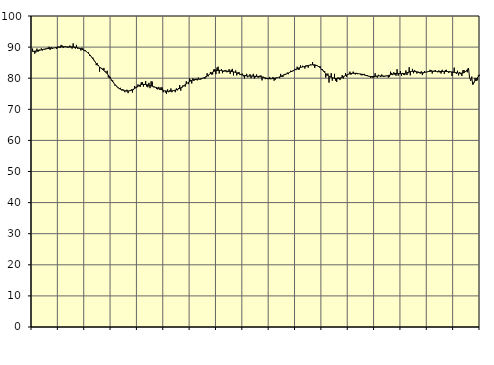
| Category | Piggar | Series 1 |
|---|---|---|
| nan | 89.5 | 88.61 |
| 87.0 | 88.5 | 88.64 |
| 87.0 | 87.9 | 88.69 |
| 87.0 | 88.3 | 88.74 |
| 87.0 | 89.5 | 88.8 |
| 87.0 | 88.5 | 88.87 |
| 87.0 | 89.2 | 88.95 |
| 87.0 | 89 | 89.03 |
| 87.0 | 89.6 | 89.12 |
| 87.0 | 88.9 | 89.22 |
| 87.0 | 89.4 | 89.3 |
| 87.0 | 89.2 | 89.38 |
| nan | 89.3 | 89.44 |
| 88.0 | 89.4 | 89.49 |
| 88.0 | 89.8 | 89.54 |
| 88.0 | 90.1 | 89.58 |
| 88.0 | 89.1 | 89.62 |
| 88.0 | 90 | 89.65 |
| 88.0 | 89.4 | 89.68 |
| 88.0 | 89.7 | 89.71 |
| 88.0 | 89.7 | 89.76 |
| 88.0 | 89.9 | 89.81 |
| 88.0 | 89.4 | 89.87 |
| 88.0 | 90.2 | 89.94 |
| nan | 90.1 | 90.01 |
| 89.0 | 89.7 | 90.06 |
| 89.0 | 90.7 | 90.1 |
| 89.0 | 90.5 | 90.12 |
| 89.0 | 89.7 | 90.12 |
| 89.0 | 90 | 90.11 |
| 89.0 | 90.3 | 90.09 |
| 89.0 | 90 | 90.08 |
| 89.0 | 89.8 | 90.07 |
| 89.0 | 89.9 | 90.07 |
| 89.0 | 90.5 | 90.08 |
| 89.0 | 89.9 | 90.08 |
| nan | 89.5 | 90.08 |
| 90.0 | 91.2 | 90.06 |
| 90.0 | 89.8 | 90.02 |
| 90.0 | 89.5 | 89.97 |
| 90.0 | 90.7 | 89.89 |
| 90.0 | 89.5 | 89.81 |
| 90.0 | 89.6 | 89.71 |
| 90.0 | 89.4 | 89.6 |
| 90.0 | 88.9 | 89.48 |
| 90.0 | 89.8 | 89.34 |
| 90.0 | 89.5 | 89.19 |
| 90.0 | 88.7 | 89.01 |
| nan | 89 | 88.81 |
| 91.0 | 88.5 | 88.56 |
| 91.0 | 88.3 | 88.27 |
| 91.0 | 88.3 | 87.94 |
| 91.0 | 87.2 | 87.57 |
| 91.0 | 87.2 | 87.16 |
| 91.0 | 86.6 | 86.7 |
| 91.0 | 86.6 | 86.22 |
| 91.0 | 85.9 | 85.73 |
| 91.0 | 85.3 | 85.23 |
| 91.0 | 84.2 | 84.76 |
| 91.0 | 84.8 | 84.32 |
| nan | 84.2 | 83.93 |
| 92.0 | 82.1 | 83.59 |
| 92.0 | 83.4 | 83.29 |
| 92.0 | 83.3 | 83.01 |
| 92.0 | 83 | 82.75 |
| 92.0 | 83.3 | 82.48 |
| 92.0 | 82 | 82.18 |
| 92.0 | 82.1 | 81.84 |
| 92.0 | 82.4 | 81.44 |
| 92.0 | 80.3 | 80.99 |
| 92.0 | 80 | 80.5 |
| 92.0 | 80.4 | 79.97 |
| nan | 79.2 | 79.44 |
| 93.0 | 79.3 | 78.92 |
| 93.0 | 78.5 | 78.43 |
| 93.0 | 77.6 | 77.99 |
| 93.0 | 77.5 | 77.59 |
| 93.0 | 77.1 | 77.25 |
| 93.0 | 76.8 | 76.95 |
| 93.0 | 76.5 | 76.7 |
| 93.0 | 76.9 | 76.48 |
| 93.0 | 76.1 | 76.31 |
| 93.0 | 76.4 | 76.17 |
| 93.0 | 76.3 | 76.06 |
| nan | 75.5 | 75.97 |
| 94.0 | 76 | 75.9 |
| 94.0 | 76.3 | 75.86 |
| 94.0 | 75.2 | 75.86 |
| 94.0 | 76 | 75.91 |
| 94.0 | 76.2 | 75.99 |
| 94.0 | 76.4 | 76.12 |
| 94.0 | 75.4 | 76.29 |
| 94.0 | 76.2 | 76.5 |
| 94.0 | 77.5 | 76.73 |
| 94.0 | 76.8 | 76.97 |
| 94.0 | 77 | 77.21 |
| nan | 78 | 77.45 |
| 95.0 | 77.4 | 77.66 |
| 95.0 | 77.2 | 77.82 |
| 95.0 | 78.7 | 77.93 |
| 95.0 | 78.7 | 78 |
| 95.0 | 77.3 | 78.02 |
| 95.0 | 77.8 | 78.01 |
| 95.0 | 79.1 | 77.98 |
| 95.0 | 77.3 | 77.92 |
| 95.0 | 77.1 | 77.85 |
| 95.0 | 78.5 | 77.76 |
| 95.0 | 76.8 | 77.66 |
| nan | 79 | 77.54 |
| 96.0 | 78.9 | 77.43 |
| 96.0 | 77.1 | 77.32 |
| 96.0 | 77.1 | 77.21 |
| 96.0 | 77 | 77.1 |
| 96.0 | 76.5 | 76.98 |
| 96.0 | 76.4 | 76.85 |
| 96.0 | 77.2 | 76.7 |
| 96.0 | 76.2 | 76.54 |
| 96.0 | 77.1 | 76.39 |
| 96.0 | 77 | 76.24 |
| 96.0 | 75.5 | 76.11 |
| nan | 76 | 76 |
| 97.0 | 75.4 | 75.91 |
| 97.0 | 75 | 75.84 |
| 97.0 | 76.4 | 75.79 |
| 97.0 | 75.5 | 75.77 |
| 97.0 | 76.1 | 75.79 |
| 97.0 | 76.7 | 75.84 |
| 97.0 | 75.5 | 75.91 |
| 97.0 | 76 | 75.99 |
| 97.0 | 75.9 | 76.08 |
| 97.0 | 75.5 | 76.17 |
| 97.0 | 76.7 | 76.27 |
| nan | 76.1 | 76.4 |
| 98.0 | 76.8 | 76.54 |
| 98.0 | 77.8 | 76.72 |
| 98.0 | 76 | 76.92 |
| 98.0 | 76.9 | 77.14 |
| 98.0 | 77.7 | 77.38 |
| 98.0 | 77.6 | 77.64 |
| 98.0 | 77.3 | 77.9 |
| 98.0 | 79 | 78.16 |
| 98.0 | 78.4 | 78.43 |
| 98.0 | 78.1 | 78.68 |
| 98.0 | 79.9 | 78.91 |
| nan | 79.5 | 79.12 |
| 99.0 | 78.3 | 79.28 |
| 99.0 | 80 | 79.41 |
| 99.0 | 79.1 | 79.51 |
| 99.0 | 79.8 | 79.58 |
| 99.0 | 79.8 | 79.63 |
| 99.0 | 79.3 | 79.66 |
| 99.0 | 80.2 | 79.69 |
| 99.0 | 79.6 | 79.73 |
| 99.0 | 79.6 | 79.79 |
| 99.0 | 79.7 | 79.87 |
| 99.0 | 80.1 | 79.98 |
| nan | 80.1 | 80.13 |
| 0.0 | 79.8 | 80.3 |
| 0.0 | 80.3 | 80.5 |
| 0.0 | 81.6 | 80.72 |
| 0.0 | 80.6 | 80.96 |
| 0.0 | 81.3 | 81.22 |
| 0.0 | 82 | 81.47 |
| 0.0 | 81.2 | 81.72 |
| 0.0 | 81.2 | 81.95 |
| 0.0 | 82.8 | 82.15 |
| 0.0 | 82.9 | 82.31 |
| 0.0 | 81.3 | 82.43 |
| nan | 83.4 | 82.5 |
| 1.0 | 83.7 | 82.53 |
| 1.0 | 81.5 | 82.53 |
| 1.0 | 82.5 | 82.49 |
| 1.0 | 82.9 | 82.43 |
| 1.0 | 81.6 | 82.37 |
| 1.0 | 82.1 | 82.32 |
| 1.0 | 82.5 | 82.28 |
| 1.0 | 82.6 | 82.26 |
| 1.0 | 81.9 | 82.24 |
| 1.0 | 82 | 82.24 |
| 1.0 | 82.9 | 82.23 |
| nan | 81.4 | 82.2 |
| 2.0 | 82.7 | 82.16 |
| 2.0 | 83 | 82.1 |
| 2.0 | 80.9 | 82.03 |
| 2.0 | 82 | 81.95 |
| 2.0 | 82.5 | 81.84 |
| 2.0 | 80.9 | 81.72 |
| 2.0 | 81.8 | 81.58 |
| 2.0 | 82 | 81.44 |
| 2.0 | 81 | 81.29 |
| 2.0 | 81.2 | 81.16 |
| 2.0 | 81.5 | 81.03 |
| nan | 80.6 | 80.93 |
| 3.0 | 79.9 | 80.84 |
| 3.0 | 81 | 80.78 |
| 3.0 | 81.4 | 80.73 |
| 3.0 | 80.3 | 80.71 |
| 3.0 | 80.7 | 80.7 |
| 3.0 | 81.3 | 80.69 |
| 3.0 | 80 | 80.68 |
| 3.0 | 80.8 | 80.66 |
| 3.0 | 81.4 | 80.65 |
| 3.0 | 79.9 | 80.63 |
| 3.0 | 80.3 | 80.62 |
| nan | 81.2 | 80.6 |
| 4.0 | 80.3 | 80.58 |
| 4.0 | 80.2 | 80.56 |
| 4.0 | 80.8 | 80.51 |
| 4.0 | 80.9 | 80.44 |
| 4.0 | 79.3 | 80.36 |
| 4.0 | 80.5 | 80.27 |
| 4.0 | 80.3 | 80.18 |
| 4.0 | 79.7 | 80.09 |
| 4.0 | 79.8 | 80 |
| 4.0 | 79.7 | 79.92 |
| 4.0 | 79.7 | 79.87 |
| nan | 80.4 | 79.84 |
| 5.0 | 79.7 | 79.83 |
| 5.0 | 79.9 | 79.85 |
| 5.0 | 80.4 | 79.89 |
| 5.0 | 79.2 | 79.94 |
| 5.0 | 79.5 | 80.01 |
| 5.0 | 80.3 | 80.09 |
| 5.0 | 80.2 | 80.18 |
| 5.0 | 80.3 | 80.29 |
| 5.0 | 80 | 80.42 |
| 5.0 | 81.4 | 80.56 |
| 5.0 | 80.5 | 80.72 |
| nan | 80.4 | 80.87 |
| 6.0 | 81.2 | 81.03 |
| 6.0 | 81.4 | 81.19 |
| 6.0 | 81.3 | 81.35 |
| 6.0 | 81.8 | 81.51 |
| 6.0 | 81.3 | 81.68 |
| 6.0 | 81.8 | 81.86 |
| 6.0 | 82.4 | 82.03 |
| 6.0 | 82 | 82.2 |
| 6.0 | 82.2 | 82.37 |
| 6.0 | 82.5 | 82.55 |
| 6.0 | 83 | 82.72 |
| nan | 82.6 | 82.89 |
| 7.0 | 83.7 | 83.06 |
| 7.0 | 82.7 | 83.21 |
| 7.0 | 82.8 | 83.34 |
| 7.0 | 84.1 | 83.46 |
| 7.0 | 83.6 | 83.55 |
| 7.0 | 84 | 83.63 |
| 7.0 | 83.7 | 83.71 |
| 7.0 | 83.1 | 83.79 |
| 7.0 | 84.1 | 83.88 |
| 7.0 | 84.1 | 83.97 |
| 7.0 | 83.4 | 84.06 |
| nan | 84.2 | 84.15 |
| 8.0 | 84.4 | 84.23 |
| 8.0 | 84.2 | 84.28 |
| 8.0 | 85.2 | 84.32 |
| 8.0 | 84.1 | 84.33 |
| 8.0 | 83.3 | 84.29 |
| 8.0 | 83.9 | 84.2 |
| 8.0 | 84.1 | 84.06 |
| 8.0 | 83.9 | 83.87 |
| 8.0 | 83.8 | 83.62 |
| 8.0 | 83.8 | 83.32 |
| 8.0 | 82.7 | 82.98 |
| nan | 82.9 | 82.61 |
| 9.0 | 82.4 | 82.23 |
| 9.0 | 82.3 | 81.86 |
| 9.0 | 80.2 | 81.51 |
| 9.0 | 80.9 | 81.19 |
| 9.0 | 81.5 | 80.91 |
| 9.0 | 78.6 | 80.68 |
| 9.0 | 80.4 | 80.48 |
| 9.0 | 81.6 | 80.32 |
| 9.0 | 79.2 | 80.18 |
| 9.0 | 80.1 | 80.07 |
| 9.0 | 81.4 | 79.97 |
| nan | 79.2 | 79.9 |
| 10.0 | 78.8 | 79.87 |
| 10.0 | 80.2 | 79.86 |
| 10.0 | 80.2 | 79.91 |
| 10.0 | 79.4 | 80 |
| 10.0 | 80.2 | 80.12 |
| 10.0 | 81 | 80.28 |
| 10.0 | 79.9 | 80.47 |
| 10.0 | 80.6 | 80.67 |
| 10.0 | 81.6 | 80.86 |
| 10.0 | 80.5 | 81.04 |
| 10.0 | 81 | 81.2 |
| nan | 81.4 | 81.33 |
| 11.0 | 82.1 | 81.44 |
| 11.0 | 81.1 | 81.52 |
| 11.0 | 81.6 | 81.57 |
| 11.0 | 82.1 | 81.59 |
| 11.0 | 81.4 | 81.59 |
| 11.0 | 81.2 | 81.57 |
| 11.0 | 81.7 | 81.53 |
| 11.0 | 81.3 | 81.49 |
| 11.0 | 81.5 | 81.44 |
| 11.0 | 81.4 | 81.39 |
| 11.0 | 81 | 81.33 |
| nan | 80.9 | 81.27 |
| 12.0 | 81.3 | 81.19 |
| 12.0 | 81.4 | 81.09 |
| 12.0 | 80.8 | 80.98 |
| 12.0 | 80.7 | 80.87 |
| 12.0 | 81 | 80.76 |
| 12.0 | 80.6 | 80.67 |
| 12.0 | 80.7 | 80.6 |
| 12.0 | 80.1 | 80.55 |
| 12.0 | 80.7 | 80.53 |
| 12.0 | 80.1 | 80.54 |
| 12.0 | 80.3 | 80.57 |
| nan | 81.6 | 80.61 |
| 13.0 | 80.5 | 80.66 |
| 13.0 | 80.2 | 80.7 |
| 13.0 | 81.1 | 80.73 |
| 13.0 | 80.8 | 80.74 |
| 13.0 | 80.4 | 80.72 |
| 13.0 | 81.2 | 80.7 |
| 13.0 | 80.8 | 80.67 |
| 13.0 | 80.4 | 80.66 |
| 13.0 | 80.7 | 80.67 |
| 13.0 | 80.8 | 80.71 |
| 13.0 | 80.7 | 80.78 |
| nan | 80.2 | 80.87 |
| 14.0 | 80.4 | 80.98 |
| 14.0 | 82.1 | 81.1 |
| 14.0 | 81.7 | 81.23 |
| 14.0 | 81 | 81.34 |
| 14.0 | 81.9 | 81.44 |
| 14.0 | 81.1 | 81.5 |
| 14.0 | 80.8 | 81.54 |
| 14.0 | 82.9 | 81.54 |
| 14.0 | 80.8 | 81.52 |
| 14.0 | 81.4 | 81.48 |
| 14.0 | 82.3 | 81.45 |
| nan | 80.8 | 81.44 |
| 15.0 | 81.7 | 81.45 |
| 15.0 | 81.1 | 81.48 |
| 15.0 | 81 | 81.54 |
| 15.0 | 82.5 | 81.63 |
| 15.0 | 81 | 81.74 |
| 15.0 | 81.6 | 81.87 |
| 15.0 | 83.5 | 81.99 |
| 15.0 | 80.9 | 82.1 |
| 15.0 | 82.3 | 82.18 |
| 15.0 | 83 | 82.23 |
| 15.0 | 81.6 | 82.23 |
| nan | 82.6 | 82.18 |
| 16.0 | 82.3 | 82.11 |
| 16.0 | 81.5 | 82.03 |
| 16.0 | 82.1 | 81.93 |
| 16.0 | 82 | 81.85 |
| 16.0 | 81.5 | 81.78 |
| 16.0 | 82.2 | 81.76 |
| 16.0 | 81 | 81.76 |
| 16.0 | 81.6 | 81.8 |
| 16.0 | 82.3 | 81.86 |
| 16.0 | 81.9 | 81.94 |
| 16.0 | 81.9 | 82.03 |
| nan | 82.1 | 82.11 |
| 17.0 | 82.2 | 82.17 |
| 17.0 | 82.7 | 82.23 |
| 17.0 | 82.6 | 82.25 |
| 17.0 | 81.5 | 82.26 |
| 17.0 | 82.1 | 82.25 |
| 17.0 | 82.4 | 82.23 |
| 17.0 | 82.6 | 82.19 |
| 17.0 | 82.1 | 82.16 |
| 17.0 | 81.9 | 82.13 |
| 17.0 | 82.5 | 82.12 |
| 17.0 | 81.9 | 82.13 |
| nan | 81.5 | 82.15 |
| 18.0 | 82.7 | 82.16 |
| 18.0 | 82.2 | 82.17 |
| 18.0 | 81.4 | 82.17 |
| 18.0 | 82.6 | 82.16 |
| 18.0 | 82.7 | 82.15 |
| 18.0 | 82.3 | 82.13 |
| 18.0 | 81.7 | 82.1 |
| 18.0 | 82.2 | 82.07 |
| 18.0 | 82 | 82.04 |
| 18.0 | 80.7 | 81.99 |
| 18.0 | 82 | 81.93 |
| nan | 83.4 | 81.87 |
| 19.0 | 81.7 | 81.81 |
| 19.0 | 81.4 | 81.76 |
| 19.0 | 82.4 | 81.71 |
| 19.0 | 80.9 | 81.67 |
| 19.0 | 81.9 | 81.64 |
| 19.0 | 81.3 | 81.61 |
| 19.0 | 80.7 | 81.62 |
| 19.0 | 82.6 | 81.68 |
| 19.0 | 82.6 | 81.81 |
| 19.0 | 82 | 82.04 |
| 19.0 | 82.2 | 82.36 |
| nan | 81.9 | 82.76 |
| 20.0 | 82.6 | 83.25 |
| 20.0 | 80.3 | 80.2 |
| 20.0 | 79.1 | 79.39 |
| 20.0 | 80.5 | 80.01 |
| 20.0 | 78.4 | 77.99 |
| 20.0 | 78.8 | 78.59 |
| 20.0 | 80.1 | 79.16 |
| 20.0 | 79.1 | 79.67 |
| 20.0 | 79.3 | 80.1 |
| 20.0 | 80.9 | 80.48 |
| 20.0 | 81.1 | 80.8 |